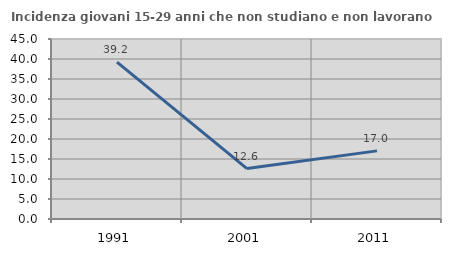
| Category | Incidenza giovani 15-29 anni che non studiano e non lavorano  |
|---|---|
| 1991.0 | 39.241 |
| 2001.0 | 12.607 |
| 2011.0 | 17.028 |